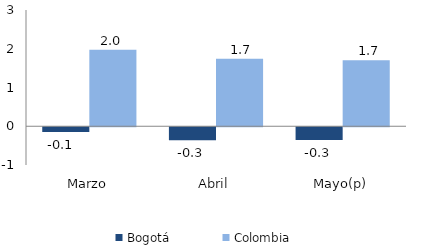
| Category | Bogotá | Colombia |
|---|---|---|
| Marzo | -0.123 | 1.971 |
| Abril | -0.335 | 1.739 |
| Mayo(p) | -0.328 | 1.701 |